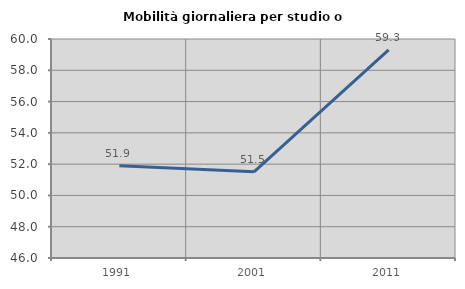
| Category | Mobilità giornaliera per studio o lavoro |
|---|---|
| 1991.0 | 51.902 |
| 2001.0 | 51.512 |
| 2011.0 | 59.308 |